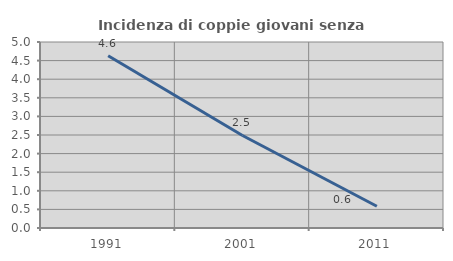
| Category | Incidenza di coppie giovani senza figli |
|---|---|
| 1991.0 | 4.63 |
| 2001.0 | 2.488 |
| 2011.0 | 0.585 |